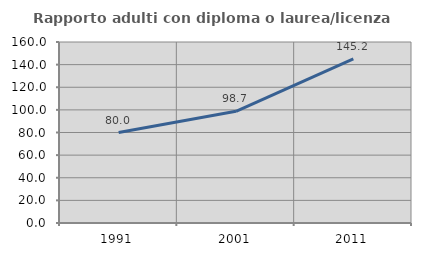
| Category | Rapporto adulti con diploma o laurea/licenza media  |
|---|---|
| 1991.0 | 80 |
| 2001.0 | 98.699 |
| 2011.0 | 145.174 |